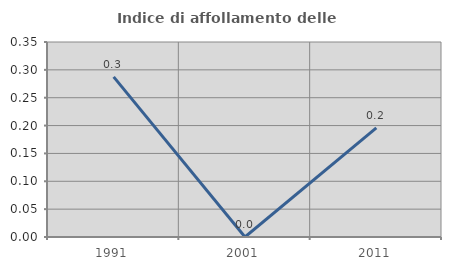
| Category | Indice di affollamento delle abitazioni  |
|---|---|
| 1991.0 | 0.287 |
| 2001.0 | 0 |
| 2011.0 | 0.196 |